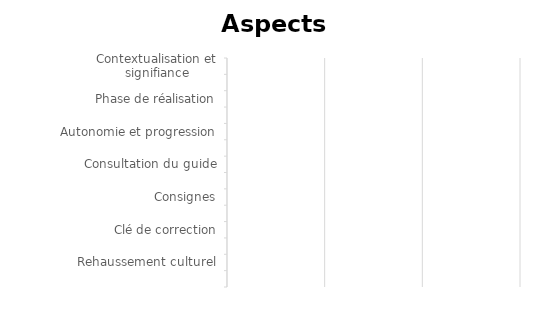
| Category | Series 0 |
|---|---|
| Contextualisation et signifiance | 0 |
| Phase de préparation | 0 |
| Phase de réalisation | 0 |
| Phase d'intégration | 0 |
| Autonomie et progression | 0 |
| Attentes de fin de cours et critères d'évaluation | 0 |
| Consultation du guide | 0 |
| Langue | 0 |
| Consignes | 0 |
| Explications | 0 |
| Clé de correction | 0 |
| Utilisation des TIC | 0 |
| Rehaussement culturel | 0 |
| Exactitude et objectivité des contenus | 0 |